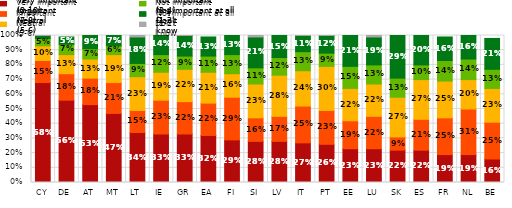
| Category | Very important (9-10) | Important (7-8) | Neutral (5-6) | Not important (3-4) | Not important at all (1-2) | Don't know |
|---|---|---|---|---|---|---|
| CY | 0.68 | 0.15 | 0.1 | 0.05 | 0.02 | 0.01 |
| DE | 0.56 | 0.18 | 0.13 | 0.07 | 0.05 | 0 |
| AT | 0.53 | 0.18 | 0.13 | 0.07 | 0.09 | 0 |
| MT | 0.47 | 0.21 | 0.19 | 0.06 | 0.07 | 0 |
| LT | 0.34 | 0.15 | 0.23 | 0.09 | 0.18 | 0.01 |
| IE | 0.33 | 0.23 | 0.19 | 0.12 | 0.14 | 0 |
| GR | 0.33 | 0.22 | 0.22 | 0.09 | 0.14 | 0.01 |
| EA | 0.32 | 0.22 | 0.21 | 0.11 | 0.13 | 0 |
| FI | 0.29 | 0.29 | 0.16 | 0.13 | 0.13 | 0 |
| SI | 0.28 | 0.16 | 0.23 | 0.11 | 0.21 | 0.01 |
| LV | 0.28 | 0.17 | 0.28 | 0.12 | 0.15 | 0 |
| IT | 0.27 | 0.25 | 0.24 | 0.13 | 0.11 | 0.01 |
| PT | 0.26 | 0.23 | 0.3 | 0.09 | 0.12 | 0.01 |
| EE | 0.23 | 0.19 | 0.22 | 0.15 | 0.21 | 0 |
| LU | 0.23 | 0.22 | 0.22 | 0.13 | 0.19 | 0.01 |
| SK | 0.22 | 0.09 | 0.27 | 0.13 | 0.29 | 0 |
| ES | 0.22 | 0.21 | 0.27 | 0.1 | 0.2 | 0 |
| FR | 0.19 | 0.25 | 0.25 | 0.14 | 0.16 | 0 |
| NL | 0.19 | 0.31 | 0.2 | 0.14 | 0.16 | 0 |
| BE | 0.16 | 0.25 | 0.23 | 0.13 | 0.21 | 0 |